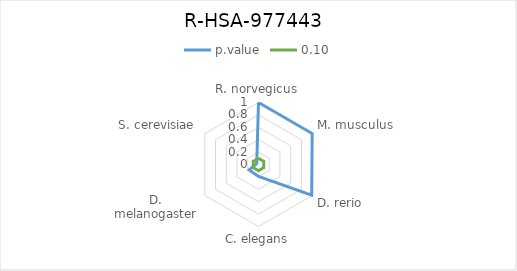
| Category | p.value | 0.10 |
|---|---|---|
| R. norvegicus | 1 | 0.1 |
| M. musculus | 1 | 0.1 |
| D. rerio | 0.991 | 0.1 |
| C. elegans | 0.193 | 0.1 |
| D. melanogaster | 0.173 | 0.1 |
| S. cerevisiae | 0.032 | 0.1 |